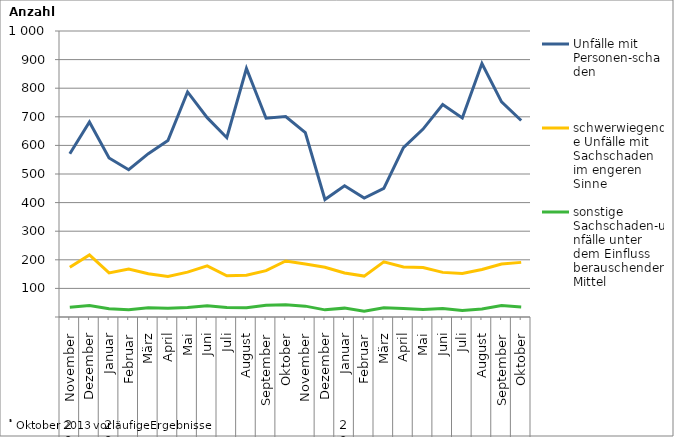
| Category | Unfälle mit Personen-schaden | schwerwiegende Unfälle mit Sachschaden   im engeren Sinne | sonstige Sachschaden-unfälle unter dem Einfluss berauschender Mittel |
|---|---|---|---|
| 0 | 571 | 174 | 34 |
| 1 | 682 | 217 | 40 |
| 2 | 556 | 154 | 29 |
| 3 | 515 | 168 | 25 |
| 4 | 571 | 151 | 32 |
| 5 | 617 | 142 | 31 |
| 6 | 787 | 157 | 33 |
| 7 | 697 | 179 | 39 |
| 8 | 627 | 144 | 33 |
| 9 | 869 | 146 | 32 |
| 10 | 695 | 162 | 41 |
| 11 | 701 | 196 | 43 |
| 12 | 645 | 185 | 38 |
| 13 | 411 | 174 | 25 |
| 14 | 459 | 154 | 31 |
| 15 | 416 | 143 | 20 |
| 16 | 450 | 193 | 32 |
| 17 | 592 | 175 | 30 |
| 18 | 657 | 173 | 26 |
| 19 | 743 | 156 | 30 |
| 20 | 696 | 152 | 23 |
| 21 | 886 | 166 | 28 |
| 22 | 752 | 185 | 40 |
| 23 | 687 | 191 | 35 |